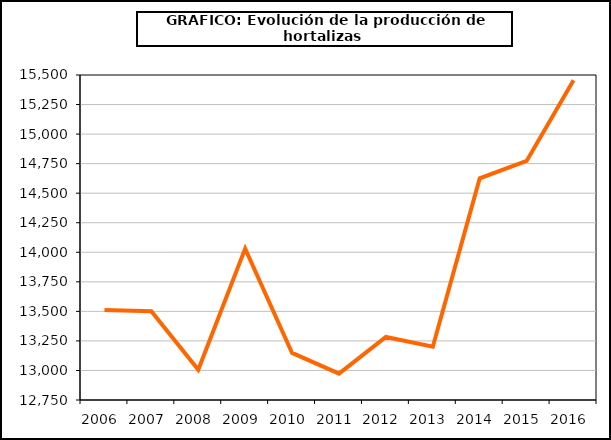
| Category | producción |
|---|---|
| 2006.0 | 13511.668 |
| 2007.0 | 13500.62 |
| 2008.0 | 13006.461 |
| 2009.0 | 14030.874 |
| 2010.0 | 13148.152 |
| 2011.0 | 12972.604 |
| 2012.0 | 13282.939 |
| 2013.0 | 13201.085 |
| 2014.0 | 14626.126 |
| 2015.0 | 14772.496 |
| 2016.0 | 15456.102 |